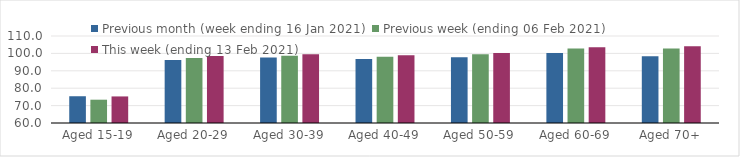
| Category | Previous month (week ending 16 Jan 2021) | Previous week (ending 06 Feb 2021) | This week (ending 13 Feb 2021) |
|---|---|---|---|
| Aged 15-19 | 75.38 | 73.39 | 75.27 |
| Aged 20-29 | 96.21 | 97.42 | 98.57 |
| Aged 30-39 | 97.59 | 98.72 | 99.51 |
| Aged 40-49 | 96.85 | 98.13 | 98.9 |
| Aged 50-59 | 97.85 | 99.47 | 100.27 |
| Aged 60-69 | 100.27 | 102.88 | 103.58 |
| Aged 70+ | 98.43 | 102.76 | 104.04 |